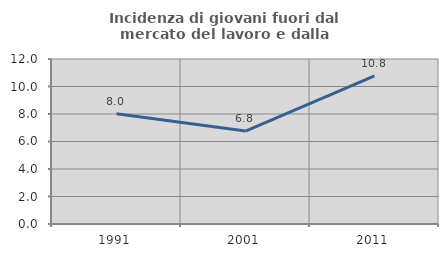
| Category | Incidenza di giovani fuori dal mercato del lavoro e dalla formazione  |
|---|---|
| 1991.0 | 8.016 |
| 2001.0 | 6.757 |
| 2011.0 | 10.773 |